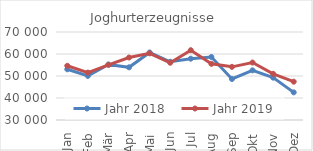
| Category | Jahr 2018 | Jahr 2019 |
|---|---|---|
| Jan | 53051.895 | 54639.625 |
| Feb | 50031.849 | 51561.892 |
| Mär | 55246.263 | 55058.99 |
| Apr | 53944.404 | 58398.238 |
| Mai | 60687.443 | 60324.147 |
| Jun | 56463.469 | 56016.859 |
| Jul | 57872.589 | 61723.633 |
| Aug | 58639.063 | 55532.517 |
| Sep | 48642.602 | 54160.403 |
| Okt | 52564.302 | 56123.685 |
| Nov | 49251.82 | 50969.89 |
| Dez | 42562.318 | 47424.873 |